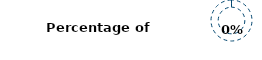
| Category | Series 0 |
|---|---|
| Complete | 0 |
| Remaining | 1 |